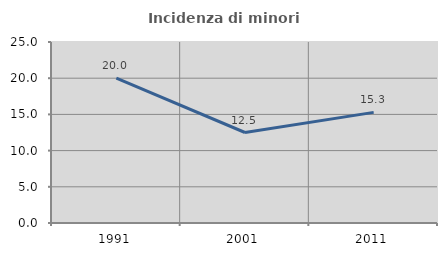
| Category | Incidenza di minori stranieri |
|---|---|
| 1991.0 | 20 |
| 2001.0 | 12.5 |
| 2011.0 | 15.278 |